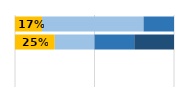
| Category | Niveles de desempeño | Series 1 | Series 2 | Series 3 |
|---|---|---|---|---|
| 0 | 0.17 | 0.638 | 0.191 | 0 |
| 1 | 0.25 | 0.25 | 0.25 | 0.25 |
| 2 | 0 | 0 | 0 | 0 |
| 3 | 0 | 0 | 0 | 0 |